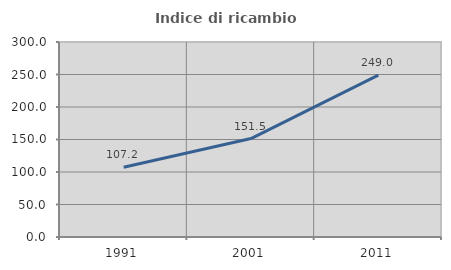
| Category | Indice di ricambio occupazionale  |
|---|---|
| 1991.0 | 107.232 |
| 2001.0 | 151.479 |
| 2011.0 | 249.042 |